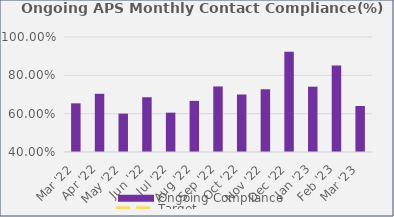
| Category | Ongoing Compliance |
|---|---|
| Mar '22 | 0.654 |
| Apr '22 | 0.704 |
| May '22 | 0.6 |
| Jun '22 | 0.686 |
| Jul '22 | 0.605 |
| Aug '22 | 0.667 |
| Sep '22 | 0.742 |
| Oct '22 | 0.7 |
| Nov '22 | 0.727 |
| Dec '22 | 0.923 |
| Jan '23 | 0.741 |
| Feb '23 | 0.852 |
| Mar '23 | 0.64 |